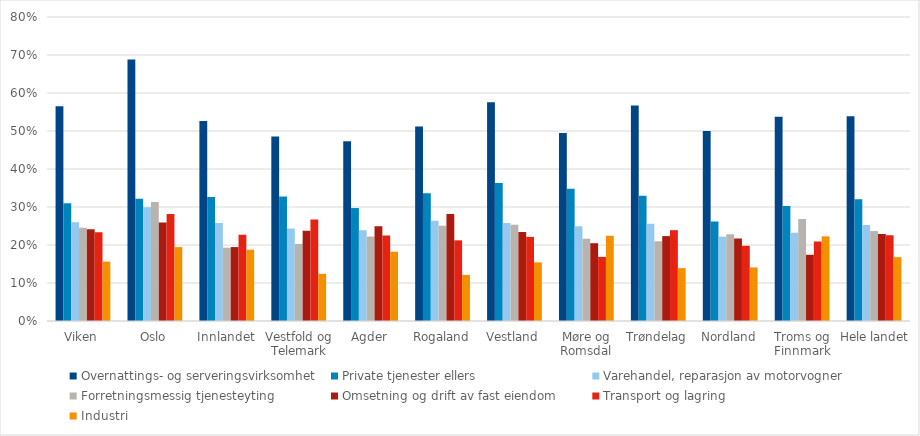
| Category | Overnattings- og serveringsvirksomhet | Private tjenester ellers | Varehandel, reparasjon av motorvogner | Forretningsmessig tjenesteyting | Omsetning og drift av fast eiendom | Transport og lagring | Industri |
|---|---|---|---|---|---|---|---|
| Viken | 0.565 | 0.31 | 0.26 | 0.245 | 0.241 | 0.234 | 0.156 |
| Oslo | 0.688 | 0.322 | 0.299 | 0.313 | 0.259 | 0.282 | 0.194 |
| Innlandet | 0.527 | 0.326 | 0.258 | 0.193 | 0.195 | 0.227 | 0.188 |
| Vestfold og Telemark | 0.485 | 0.328 | 0.244 | 0.203 | 0.238 | 0.267 | 0.124 |
| Agder | 0.473 | 0.297 | 0.239 | 0.222 | 0.249 | 0.225 | 0.182 |
| Rogaland | 0.512 | 0.336 | 0.264 | 0.25 | 0.281 | 0.212 | 0.121 |
| Vestland | 0.576 | 0.363 | 0.258 | 0.253 | 0.234 | 0.221 | 0.154 |
| Møre og Romsdal | 0.495 | 0.348 | 0.249 | 0.216 | 0.205 | 0.169 | 0.224 |
| Trøndelag | 0.567 | 0.329 | 0.256 | 0.21 | 0.223 | 0.239 | 0.139 |
| Nordland | 0.5 | 0.262 | 0.222 | 0.228 | 0.217 | 0.198 | 0.141 |
| Troms og Finnmark | 0.538 | 0.302 | 0.232 | 0.269 | 0.174 | 0.209 | 0.223 |
| Hele landet | 0.539 | 0.32 | 0.253 | 0.237 | 0.229 | 0.226 | 0.168 |